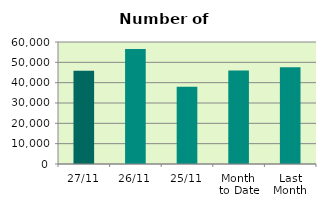
| Category | Series 0 |
|---|---|
| 27/11 | 45854 |
| 26/11 | 56524 |
| 25/11 | 37950 |
| Month 
to Date | 45938.211 |
| Last
Month | 47528 |